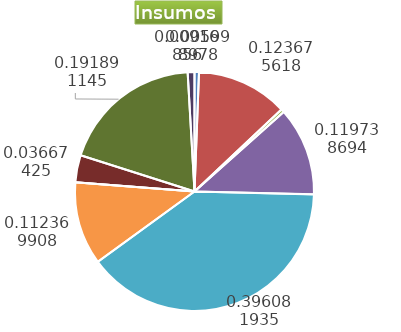
| Category | Series 0 |
|---|---|
| Control arvenses | 542489 |
| Control fitosanitario | 11184015 |
| Cosecha y beneficio | 397975.352 |
| Fertilización | 10827998 |
| Instalación | 35817781.69 |
| Otros | 10161637 |
| Podas | 0 |
| Riego | 3316461 |
| Transporte | 17352761 |
| Tutorado | 829115 |